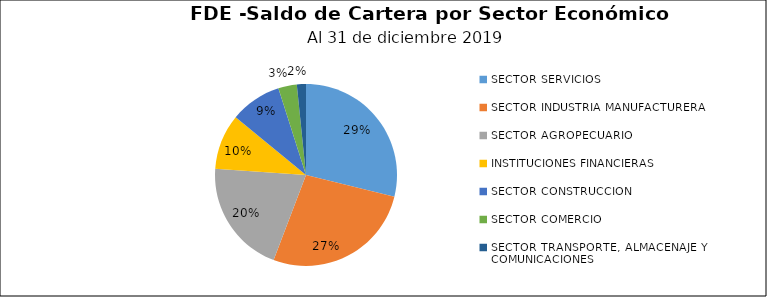
| Category | Saldo | Créditos |
|---|---|---|
| SECTOR SERVICIOS | 13.45 | 181 |
| SECTOR INDUSTRIA MANUFACTURERA | 12.578 | 225 |
| SECTOR AGROPECUARIO | 9.475 | 87 |
| INSTITUCIONES FINANCIERAS | 4.588 | 7 |
| SECTOR CONSTRUCCION | 4.271 | 13 |
| SECTOR COMERCIO | 1.535 | 177 |
| SECTOR TRANSPORTE, ALMACENAJE Y COMUNICACIONES | 0.753 | 6 |